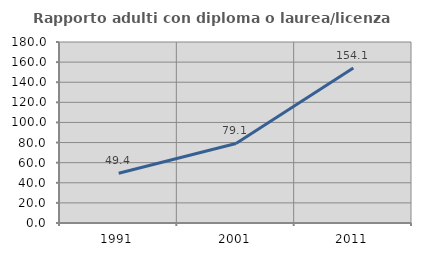
| Category | Rapporto adulti con diploma o laurea/licenza media  |
|---|---|
| 1991.0 | 49.416 |
| 2001.0 | 79.095 |
| 2011.0 | 154.121 |